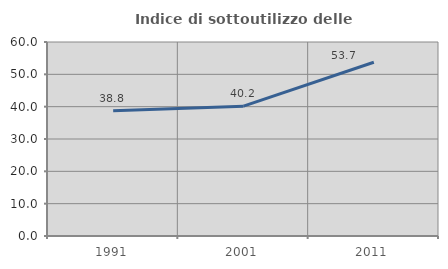
| Category | Indice di sottoutilizzo delle abitazioni  |
|---|---|
| 1991.0 | 38.757 |
| 2001.0 | 40.162 |
| 2011.0 | 53.731 |